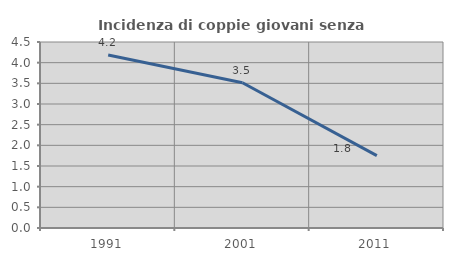
| Category | Incidenza di coppie giovani senza figli |
|---|---|
| 1991.0 | 4.186 |
| 2001.0 | 3.513 |
| 2011.0 | 1.752 |